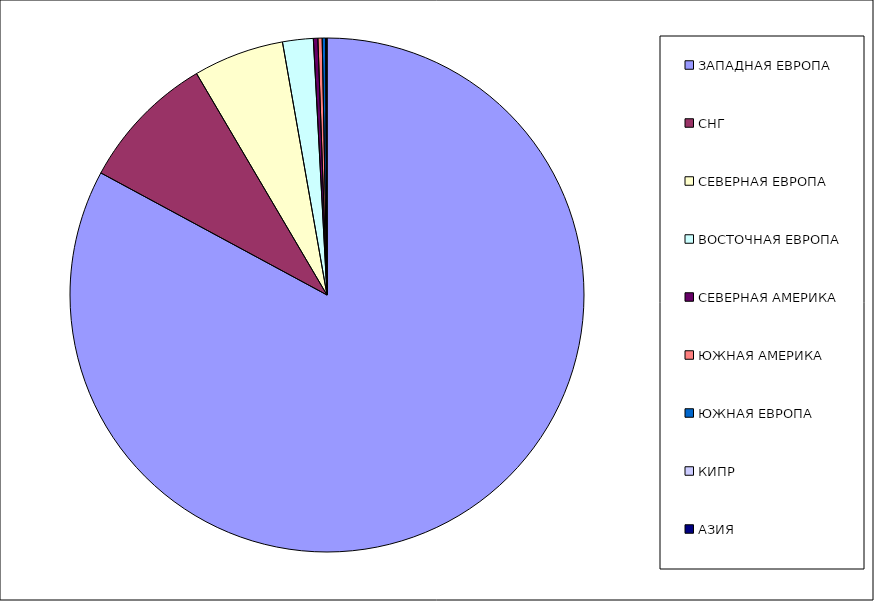
| Category | Оборот |
|---|---|
| ЗАПАДНАЯ ЕВРОПА | 0.829 |
| СНГ | 0.086 |
| СЕВЕРНАЯ ЕВРОПА | 0.057 |
| ВОСТОЧНАЯ ЕВРОПА | 0.019 |
| СЕВЕРНАЯ АМЕРИКА | 0.003 |
| ЮЖНАЯ АМЕРИКА | 0.003 |
| ЮЖНАЯ ЕВРОПА | 0.002 |
| КИПР | 0.001 |
| АЗИЯ | 0 |